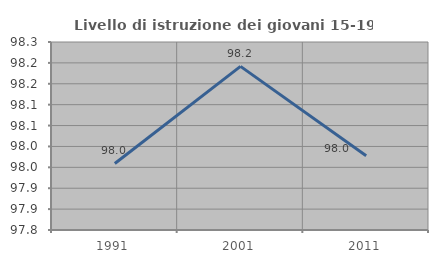
| Category | Livello di istruzione dei giovani 15-19 anni |
|---|---|
| 1991.0 | 97.959 |
| 2001.0 | 98.192 |
| 2011.0 | 97.978 |